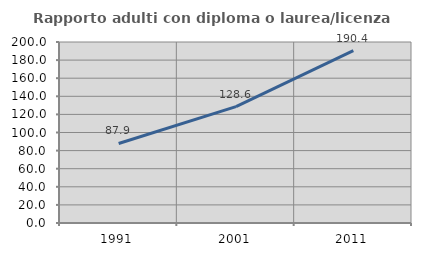
| Category | Rapporto adulti con diploma o laurea/licenza media  |
|---|---|
| 1991.0 | 87.866 |
| 2001.0 | 128.615 |
| 2011.0 | 190.446 |